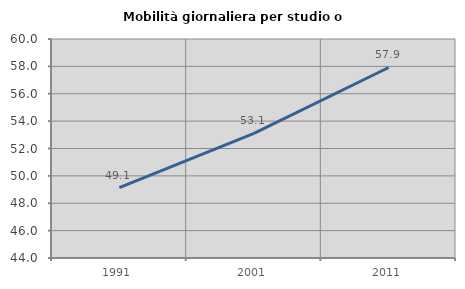
| Category | Mobilità giornaliera per studio o lavoro |
|---|---|
| 1991.0 | 49.143 |
| 2001.0 | 53.105 |
| 2011.0 | 57.919 |